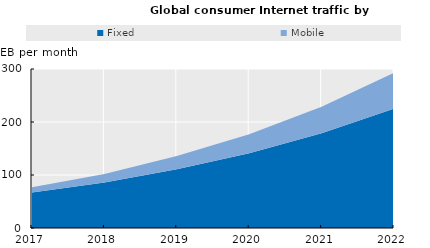
| Category | Fixed | Mobile |
|---|---|---|
| 2017.0 | 67.081 | 10 |
| 2018.0 | 86 | 16 |
| 2019.0 | 111 | 25 |
| 2020.0 | 141 | 36 |
| 2021.0 | 179 | 50 |
| 2022.0 | 225 | 68 |